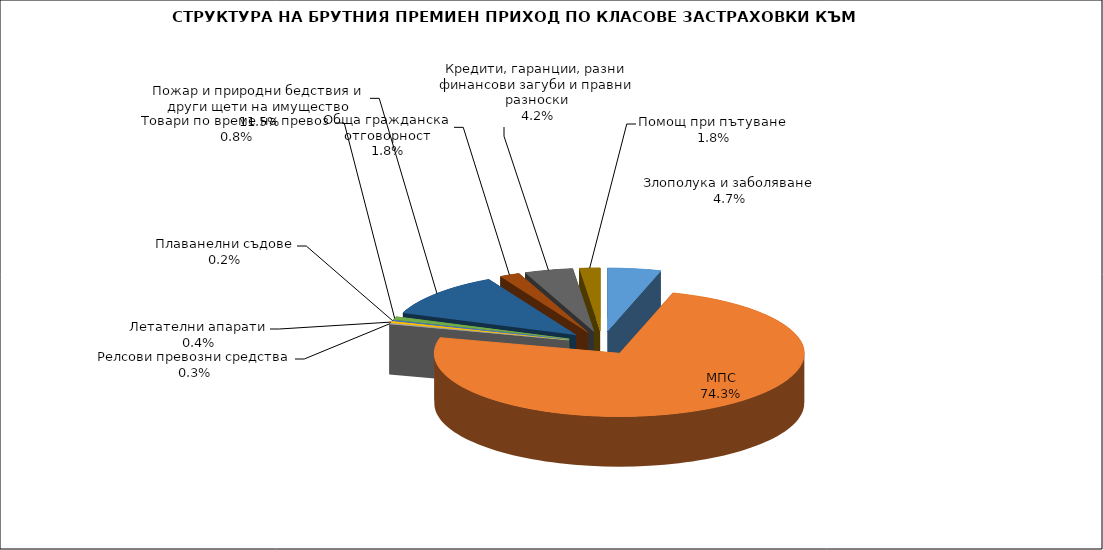
| Category | Злополука и заболяване |
|---|---|
| Злополука и заболяване | 0.047 |
| МПС | 0.743 |
| Релсови превозни средства | 0.003 |
| Летателни апарати | 0.004 |
| Плаванелни съдове | 0.002 |
| Товари по време на превоз | 0.008 |
| Пожар и природни бедствия и други щети на имущество | 0.115 |
| Обща гражданска отговорност | 0.018 |
| Кредити, гаранции, разни финансови загуби и правни разноски | 0.042 |
| Помощ при пътуване | 0.018 |